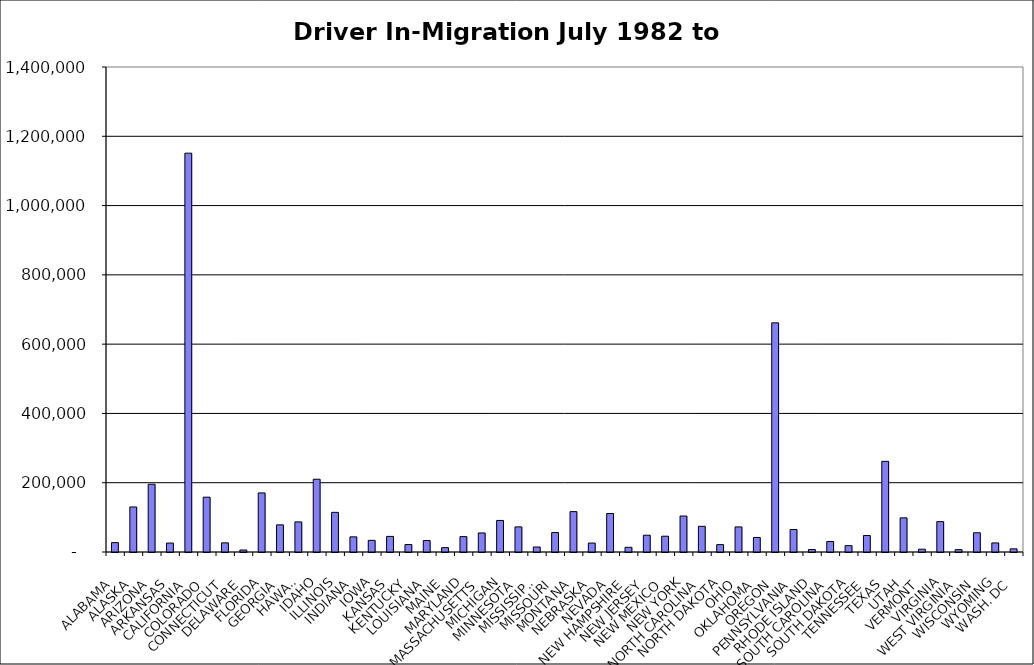
| Category | Series 0 |
|---|---|
| ALABAMA | 27095.5 |
| ALASKA | 130004.5 |
| ARIZONA | 195529 |
| ARKANSAS | 25814.5 |
| CALIFORNIA | 1151252.5 |
| COLORADO | 158251 |
| CONNECTICUT | 26346 |
| DELAWARE | 5779.5 |
| FLORIDA | 170527 |
| GEORGIA | 78373 |
| HAWAII | 86844.5 |
| IDAHO | 210032.5 |
| ILLINOIS | 114444.5 |
| INDIANA | 43706 |
| IOWA | 33614.5 |
| KANSAS | 45020.5 |
| KENTUCKY | 21448 |
| LOUISIANA | 33031.5 |
| MAINE | 12531.5 |
| MARYLAND | 44399 |
| MASSACHUSETTS | 54963 |
| MICHIGAN | 91070 |
| MINNESOTA | 72479.5 |
| MISSISSIPPI | 14420 |
| MISSOURI | 56123 |
| MONTANA | 116568 |
| NEBRASKA | 25824.5 |
| NEVADA | 111105 |
| NEW HAMPSHIRE | 13572.5 |
| NEW JERSEY | 48425 |
| NEW MEXICO | 45559 |
| NEW YORK | 103833 |
| NORTH CAROLINA | 74173.5 |
| NORTH DAKOTA | 21262.5 |
| OHIO | 72395.5 |
| OKLAHOMA | 41982 |
| OREGON | 661499 |
| PENNSYLVANIA | 65007.5 |
| RHODE ISLAND | 7163 |
| SOUTH CAROLINA | 30332.5 |
| SOUTH DAKOTA | 18364.5 |
| TENNESSEE | 47627.5 |
| TEXAS | 261679 |
| UTAH | 98532.5 |
| VERMONT | 7997 |
| VIRGINIA | 87677 |
| WEST VIRGINIA | 6758.5 |
| WISCONSIN | 55540.5 |
| WYOMING | 26201 |
| WASH. DC | 9115 |